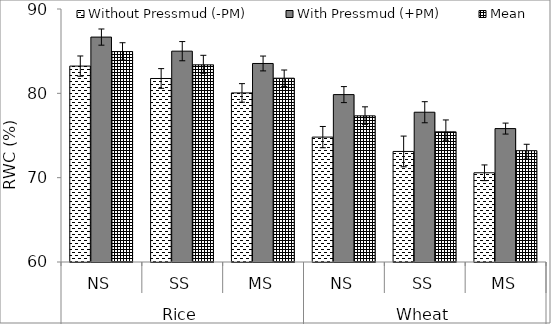
| Category | Without Pressmud (-PM) | With Pressmud (+PM) | Mean |
|---|---|---|---|
| 0 | 83.23 | 86.67 | 84.95 |
| 1 | 81.76 | 85 | 83.38 |
| 2 | 80.05 | 83.54 | 81.795 |
| 3 | 74.81 | 79.85 | 77.33 |
| 4 | 73.11 | 77.76 | 75.435 |
| 5 | 70.58 | 75.82 | 73.2 |